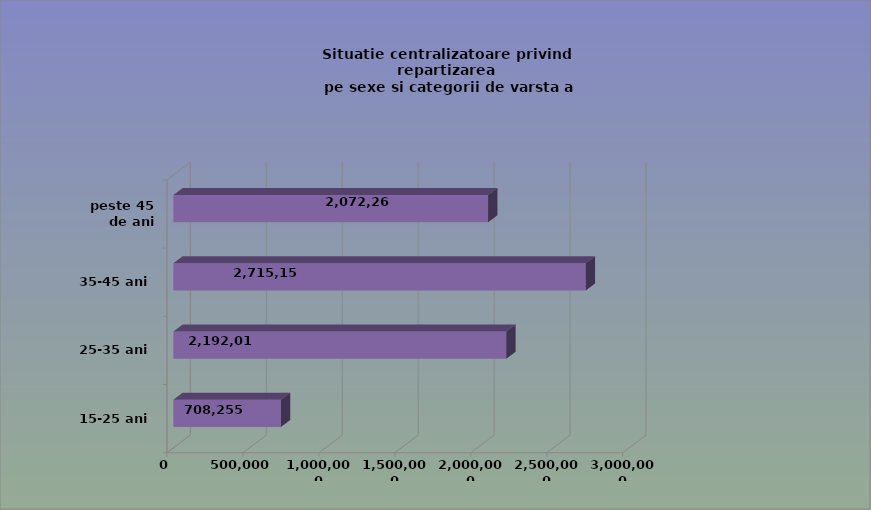
| Category | 15-25 ani 25-35 ani 35-45 ani peste 45 de ani |
|---|---|
| 15-25 ani | 708255 |
| 25-35 ani | 2192018 |
| 35-45 ani | 2715154 |
| peste 45 de ani | 2072261 |